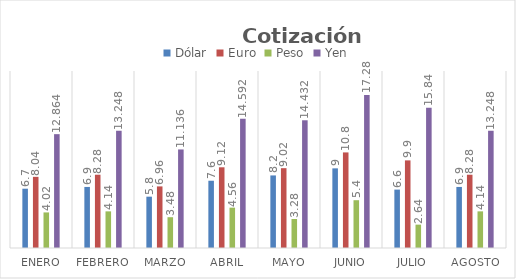
| Category | Dólar | Euro | Peso | Yen |
|---|---|---|---|---|
| Enero | 6.7 | 8.04 | 4.02 | 12.864 |
| Febrero | 6.9 | 8.28 | 4.14 | 13.248 |
| Marzo | 5.8 | 6.96 | 3.48 | 11.136 |
| Abril | 7.6 | 9.12 | 4.56 | 14.592 |
| Mayo | 8.2 | 9.02 | 3.28 | 14.432 |
| Junio | 9 | 10.8 | 5.4 | 17.28 |
| Julio | 6.6 | 9.9 | 2.64 | 15.84 |
| Agosto | 6.9 | 8.28 | 4.14 | 13.248 |